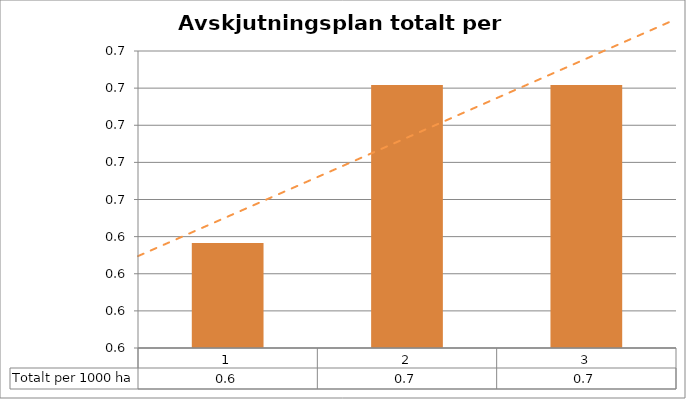
| Category | Totalt per 1000 ha |
|---|---|
| 0 | 0.638 |
| 1 | 0.681 |
| 2 | 0.681 |